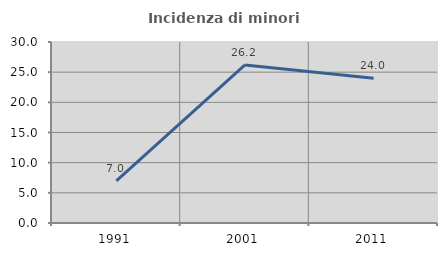
| Category | Incidenza di minori stranieri |
|---|---|
| 1991.0 | 6.993 |
| 2001.0 | 26.203 |
| 2011.0 | 24.001 |